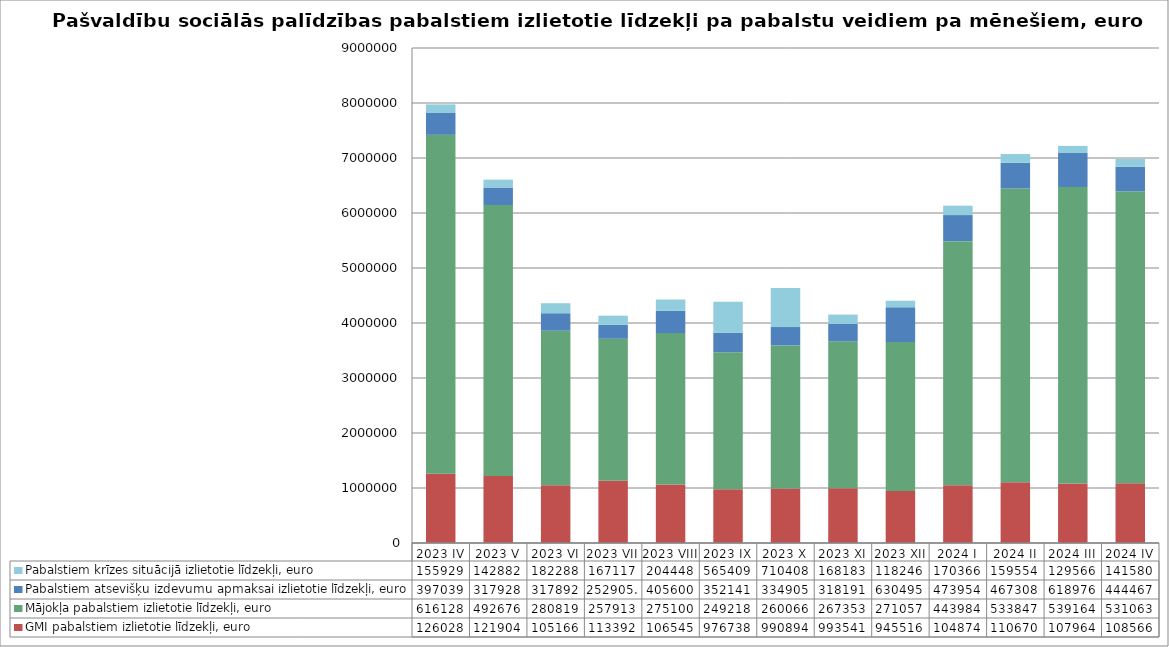
| Category | GMI pabalstiem izlietotie līdzekļi, euro | Mājokļa pabalstiem izlietotie līdzekļi, euro | Pabalstiem atsevišķu izdevumu apmaksai izlietotie līdzekļi, euro | Pabalstiem krīzes situācijā izlietotie līdzekļi, euro |
|---|---|---|---|---|
| 2023 IV | 1260284 | 6161284 | 397039 | 155929 |
| 2023 V | 1219045 | 4926766 | 317928 | 142882 |
| 2023 VI | 1051662 | 2808191 | 317892 | 182288 |
| 2023 VII | 1133928 | 2579133.39 | 252905.97 | 167117 |
| 2023 VIII | 1065452 | 2751005 | 405600 | 204448 |
| 2023 IX | 976738 | 2492186 | 352141 | 565409 |
| 2023 X | 990894 | 2600664 | 334905 | 710408 |
| 2023 XI | 993541 | 2673538 | 318191 | 168183 |
| 2023 XII | 945516 | 2710572 | 630495 | 118246 |
| 2024 I | 1048744 | 4439843 | 473954 | 170366 |
| 2024 II | 1106705 | 5338474 | 467308 | 159554 |
| 2024 III | 1079648 | 5391646 | 618976 | 129566 |
| 2024 IV | 1085665 | 5310630 | 444467 | 141580 |